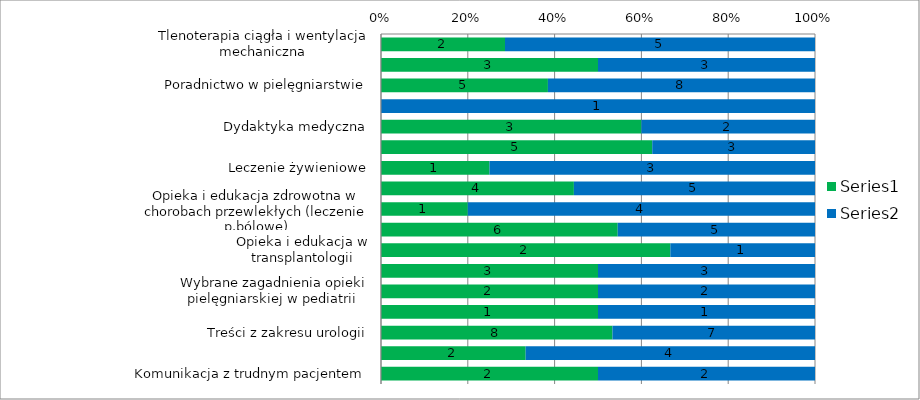
| Category | Series 0 | Series 1 |
|---|---|---|
| Tlenoterapia ciągła i wentylacja mechaniczna | 2 | 5 |
| Endoskopia | 3 | 3 |
| Poradnictwo w pielęgniarstwie | 5 | 8 |
| Język angielski | 0 | 1 |
| Dydaktyka medyczna | 3 | 2 |
| Koordynowana opieka zdrowotna | 5 | 3 |
| Leczenie żywieniowe | 1 | 3 |
| Promocja zdrowia i świadczenia profilaktycze | 4 | 5 |
| Opieka i edukacja zdrowotna w chorobach przewlekłych (leczenie p.bólowe) | 1 | 4 |
| Opieka i edukacja zdrowotna w zakresie ran przewlekłych i przetok | 6 | 5 |
| Opieka i edukacja w transplantologii | 2 | 1 |
| Badania naukowe w pielęgniarstwie  | 3 | 3 |
| Wybrane zagadnienia opieki pielęgniarskiej w pediatrii  | 2 | 2 |
| Zajęcia fakultatywne  | 1 | 1 |
| Treści z zakresu urologii | 8 | 7 |
| Badania kliniczne  | 2 | 4 |
| Komunikacja z trudnym pacjentem  | 2 | 2 |